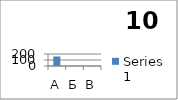
| Category | Series 0 |
|---|---|
| А | 159 |
| Б | 5 |
| В | 0 |